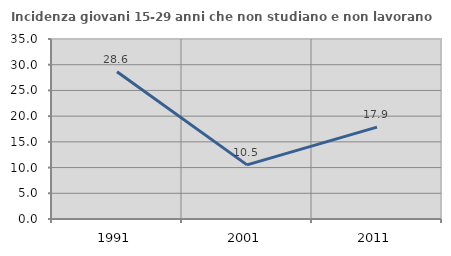
| Category | Incidenza giovani 15-29 anni che non studiano e non lavorano  |
|---|---|
| 1991.0 | 28.633 |
| 2001.0 | 10.526 |
| 2011.0 | 17.857 |